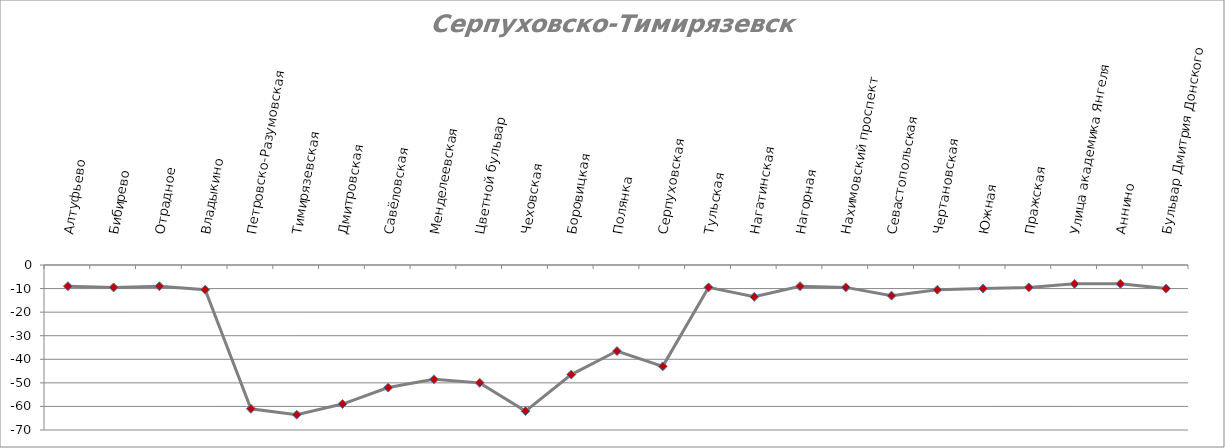
| Category | Series 0 |
|---|---|
| Алтуфьево | -9 |
| Бибирево | -9.5 |
| Отрадное | -9 |
| Владыкино | -10.5 |
| Петровско-Разумовская | -61 |
| Тимирязевская | -63.5 |
| Дмитровская | -59 |
| Савёловская | -52 |
| Менделеевская | -48.5 |
| Цветной бульвар | -50 |
| Чеховская | -62 |
| Боровицкая | -46.5 |
| Полянка | -36.5 |
| Серпуховская | -43 |
| Тульская | -9.5 |
| Нагатинская | -13.5 |
| Нагорная | -9 |
| Нахимовский проспект | -9.5 |
| Севастопольская | -13 |
| Чертановская | -10.5 |
| Южная | -10 |
| Пражская | -9.5 |
| Улица академика Янгеля | -8 |
| Аннино | -8 |
| Бульвар Дмитрия Донского | -10 |